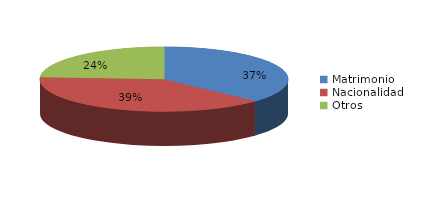
| Category | Series 0 |
|---|---|
| Matrimonio | 462 |
| Nacionalidad | 487 |
| Otros | 301 |